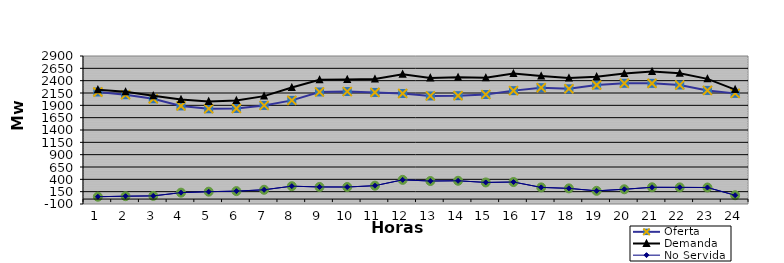
| Category | Oferta | No Servida | Demanda |
|---|---|---|---|
| 1.0 | 2170.03 | 47.284 | 2217.314 |
| 2.0 | 2114.64 | 58.419 | 2173.059 |
| 3.0 | 2031.81 | 64.339 | 2096.149 |
| 4.0 | 1888.32 | 129.962 | 2018.282 |
| 5.0 | 1830.46 | 149.471 | 1979.931 |
| 6.0 | 1836.73 | 161.189 | 1997.919 |
| 7.0 | 1898.42 | 188.263 | 2086.683 |
| 8.0 | 2000.26 | 261.315 | 2261.575 |
| 9.0 | 2170.88 | 245.529 | 2416.409 |
| 10.0 | 2179.56 | 244.506 | 2424.066 |
| 11.0 | 2161.46 | 271.313 | 2432.773 |
| 12.0 | 2140.43 | 389.603 | 2530.033 |
| 13.0 | 2090.58 | 365.713 | 2456.293 |
| 14.0 | 2096.08 | 370.826 | 2466.906 |
| 15.0 | 2119.71 | 337.384 | 2457.094 |
| 16.0 | 2198.05 | 345.328 | 2543.378 |
| 17.0 | 2257.91 | 236.553 | 2494.463 |
| 18.0 | 2235.07 | 216.718 | 2451.788 |
| 19.0 | 2311.95 | 166.714 | 2478.664 |
| 20.0 | 2346.65 | 198.492 | 2545.142 |
| 21.0 | 2345.2 | 238.853 | 2584.053 |
| 22.0 | 2312.44 | 237.225 | 2549.665 |
| 23.0 | 2202.43 | 234.22 | 2436.65 |
| 24.0 | 2142.33 | 77.25 | 2219.58 |